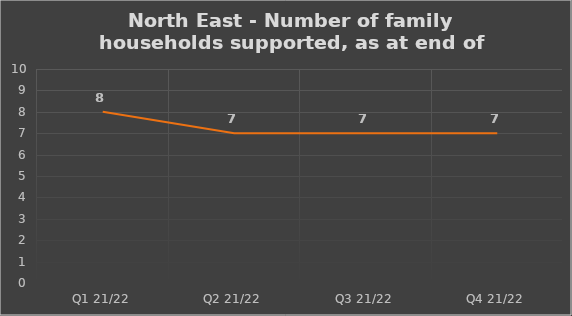
| Category | Number of financially supported households at end of quarter |
|---|---|
| Q1 21/22 | 8 |
| Q2 21/22 | 7 |
| Q3 21/22 | 7 |
| Q4 21/22 | 7 |